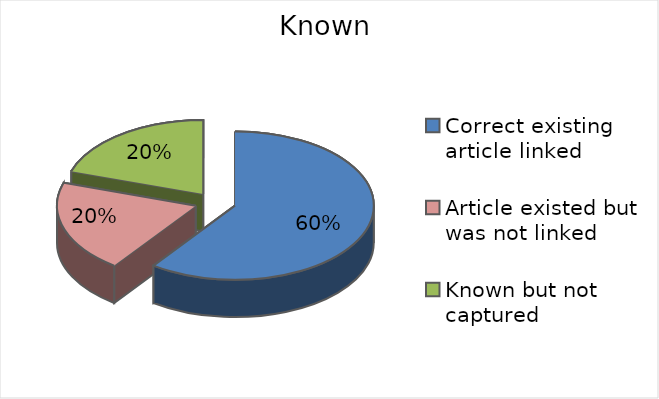
| Category | Series 0 |
|---|---|
| Correct existing article linked | 6 |
| Article existed but was not linked | 2 |
| Known but not captured | 2 |